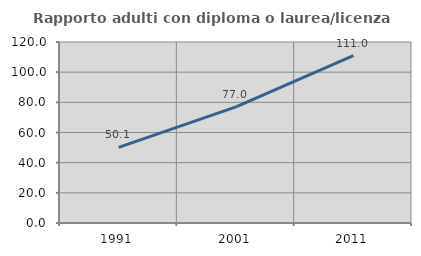
| Category | Rapporto adulti con diploma o laurea/licenza media  |
|---|---|
| 1991.0 | 50.131 |
| 2001.0 | 76.982 |
| 2011.0 | 111.034 |